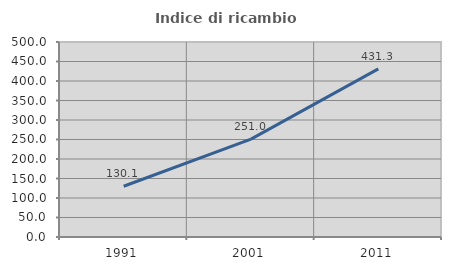
| Category | Indice di ricambio occupazionale  |
|---|---|
| 1991.0 | 130.075 |
| 2001.0 | 250.98 |
| 2011.0 | 431.25 |